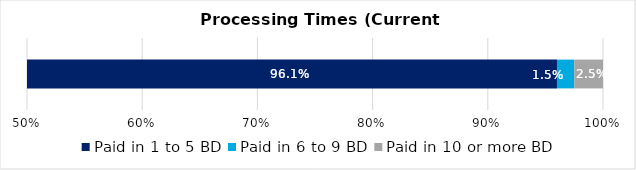
| Category | Paid in 1 to 5 BD | Paid in 6 to 9 BD | Paid in 10 or more BD |
|---|---|---|---|
| 0 | 0.961 | 0.015 | 0.025 |